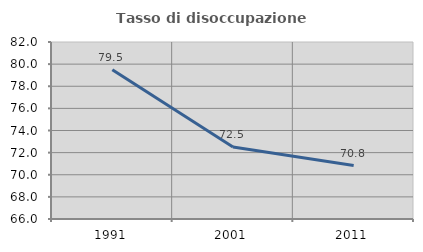
| Category | Tasso di disoccupazione giovanile  |
|---|---|
| 1991.0 | 79.487 |
| 2001.0 | 72.5 |
| 2011.0 | 70.833 |